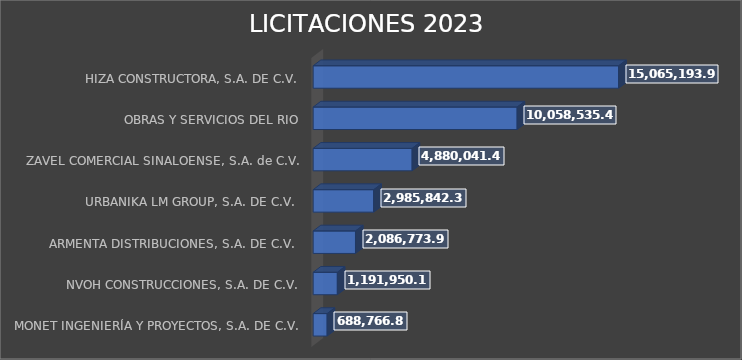
| Category | SUMA |
|---|---|
| MONET INGENIERÍA Y PROYECTOS, S.A. DE C.V. | 688766.8 |
| NVOH CONSTRUCCIONES, S.A. DE C.V. | 1191950.12 |
| ARMENTA DISTRIBUCIONES, S.A. DE C.V.  | 2086773.96 |
| URBANIKA LM GROUP, S.A. DE C.V.  | 2985842.34 |
| ZAVEL COMERCIAL SINALOENSE, S.A. de C.V. | 4880041.43 |
| OBRAS Y SERVICIOS DEL RIO | 10058535.44 |
| HIZA CONSTRUCTORA, S.A. DE C.V. | 15065193.94 |